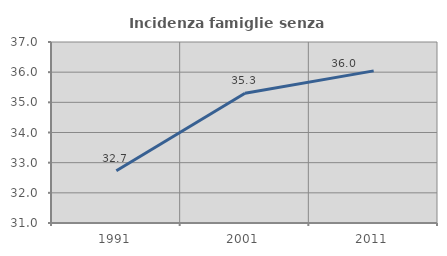
| Category | Incidenza famiglie senza nuclei |
|---|---|
| 1991.0 | 32.733 |
| 2001.0 | 35.304 |
| 2011.0 | 36.042 |